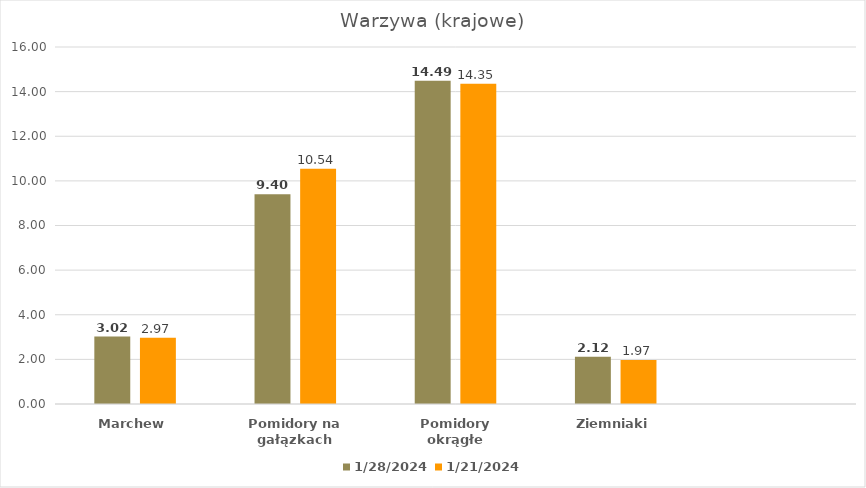
| Category | 28.01.2024 | 21.01.2024 |
|---|---|---|
| Marchew | 3.02 | 2.97 |
| Pomidory na gałązkach | 9.4 | 10.54 |
| Pomidory okrągłe | 14.49 | 14.35 |
| Ziemniaki | 2.12 | 1.97 |